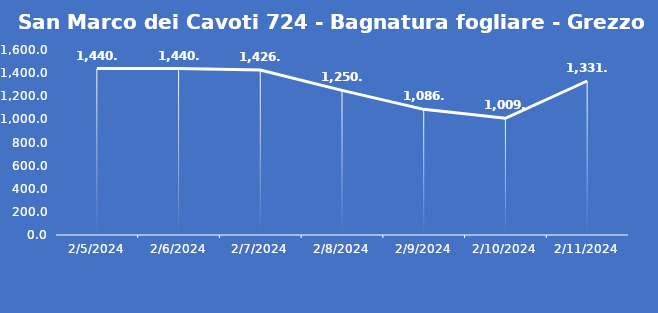
| Category | San Marco dei Cavoti 724 - Bagnatura fogliare - Grezzo (min) |
|---|---|
| 2/5/24 | 1440 |
| 2/6/24 | 1440 |
| 2/7/24 | 1426.7 |
| 2/8/24 | 1250.7 |
| 2/9/24 | 1086.7 |
| 2/10/24 | 1009.3 |
| 2/11/24 | 1331.9 |